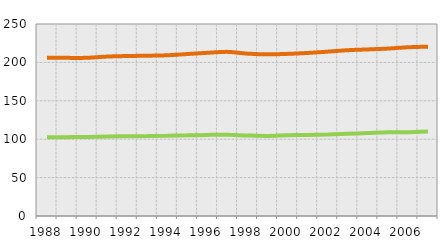
| Category | Unit Labor
Costs Index | Labor 
Compensation
 Index |
|---|---|---|
| 1988.0 | 102.5 | 103.5 |
| 1989.0 | 102.7 | 103.2 |
| 1990.0 | 102.9 | 103.1 |
| 1991.0 | 103.5 | 104.1 |
| 1992.0 | 103.8 | 104.5 |
| 1993.0 | 104.1 | 104.6 |
| 1994.0 | 104.5 | 104.8 |
| 1995.0 | 105 | 105.9 |
| 1996.0 | 105.6 | 106.9 |
| 1997.0 | 105.8 | 107.9 |
| 1998.0 | 104.9 | 106.5 |
| 1999.0 | 104.3 | 106.2 |
| 2000.0 | 105.2 | 105.9 |
| 2001.0 | 105.5 | 106.8 |
| 2002.0 | 106.2 | 107.8 |
| 2003.0 | 107.1 | 108.8 |
| 2004.0 | 108 | 108.9 |
| 2005.0 | 108.9 | 109.1 |
| 2006.0 | 109.2 | 110.5 |
| 2007.0 | 109.9 | 110.6 |